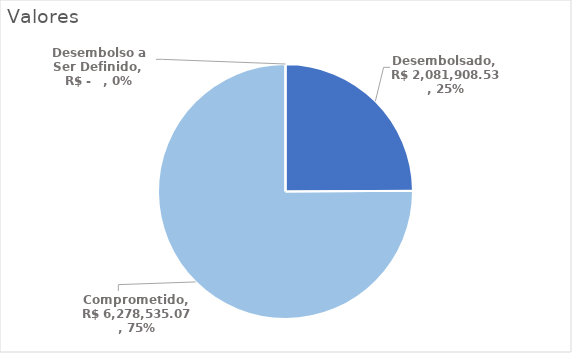
| Category | Valores |
|---|---|
| Desembolsado | 2081908.53 |
| Comprometido | 6278535.07 |
| Desembolso a Ser Definido | 0 |